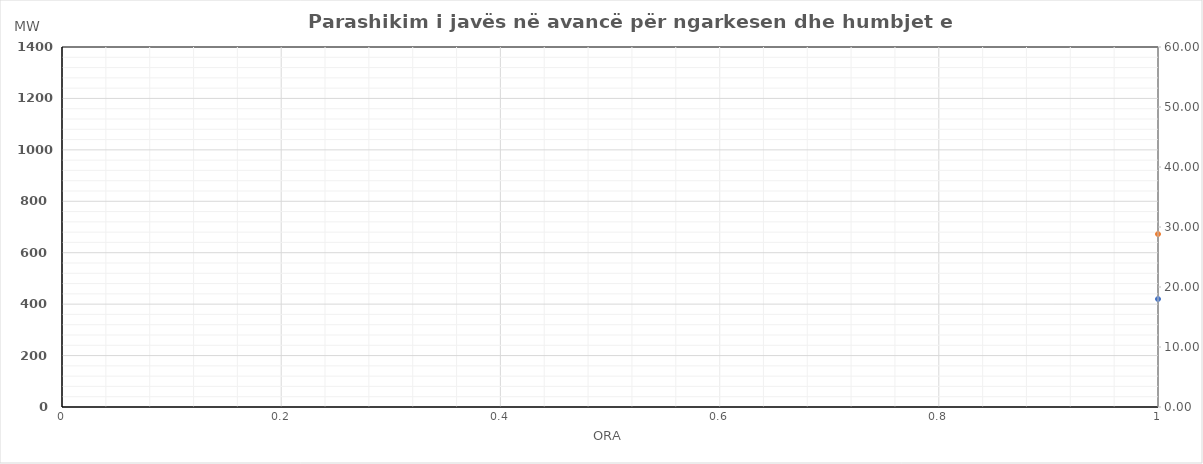
| Category | Ngarkesa (MWh) |
|---|---|
| 0 | 672.48 |
| 1 | 583.19 |
| 2 | 541.71 |
| 3 | 527.18 |
| 4 | 534 |
| 5 | 599 |
| 6 | 783.46 |
| 7 | 1047.6 |
| 8 | 1144.16 |
| 9 | 1153.89 |
| 10 | 1123.81 |
| 11 | 1043.94 |
| 12 | 1044.64 |
| 13 | 1029.51 |
| 14 | 1043.85 |
| 15 | 1056.7 |
| 16 | 1083.35 |
| 17 | 1177.5 |
| 18 | 1193.12 |
| 19 | 1138.35 |
| 20 | 1100.6 |
| 21 | 989.45 |
| 22 | 831.55 |
| 23 | 647.25 |
| 24 | 648.11 |
| 25 | 562.27 |
| 26 | 522.15 |
| 27 | 509.23 |
| 28 | 529.05 |
| 29 | 582.92 |
| 30 | 767.7 |
| 31 | 1034.07 |
| 32 | 1101.57 |
| 33 | 1067.79 |
| 34 | 1010.06 |
| 35 | 963.47 |
| 36 | 942.06 |
| 37 | 968.38 |
| 38 | 996.35 |
| 39 | 1006.48 |
| 40 | 1038.34 |
| 41 | 1187.85 |
| 42 | 1260.23 |
| 43 | 1254.3 |
| 44 | 1225 |
| 45 | 1113.99 |
| 46 | 954.74 |
| 47 | 776.86 |
| 48 | 628.65 |
| 49 | 544.87 |
| 50 | 508.05 |
| 51 | 497.04 |
| 52 | 506.14 |
| 53 | 571.02 |
| 54 | 756.66 |
| 55 | 1019.82 |
| 56 | 1093.47 |
| 57 | 1067.69 |
| 58 | 1003.68 |
| 59 | 953.72 |
| 60 | 930.95 |
| 61 | 953.04 |
| 62 | 976.3 |
| 63 | 985.27 |
| 64 | 1020.17 |
| 65 | 1167.2 |
| 66 | 1240.52 |
| 67 | 1246.43 |
| 68 | 1217.63 |
| 69 | 1107.74 |
| 70 | 964.06 |
| 71 | 809.66 |
| 72 | 672.04 |
| 73 | 578.37 |
| 74 | 534.25 |
| 75 | 519.94 |
| 76 | 524.23 |
| 77 | 596.14 |
| 78 | 781.55 |
| 79 | 1046.92 |
| 80 | 1112.47 |
| 81 | 1115.49 |
| 82 | 1031.78 |
| 83 | 978.42 |
| 84 | 955.14 |
| 85 | 992.45 |
| 86 | 1011.41 |
| 87 | 1028.73 |
| 88 | 1072.06 |
| 89 | 1216.78 |
| 90 | 1305.5 |
| 91 | 1299.12 |
| 92 | 1267.93 |
| 93 | 1157.12 |
| 94 | 1003.13 |
| 95 | 819.06 |
| 96 | 663.55 |
| 97 | 592.28 |
| 98 | 546.64 |
| 99 | 532.03 |
| 100 | 541.02 |
| 101 | 608.63 |
| 102 | 792.85 |
| 103 | 1060.23 |
| 104 | 1127.97 |
| 105 | 1103.39 |
| 106 | 1008.68 |
| 107 | 959.12 |
| 108 | 938.44 |
| 109 | 959.22 |
| 110 | 987.99 |
| 111 | 1000.75 |
| 112 | 1044.08 |
| 113 | 1198.69 |
| 114 | 1282.22 |
| 115 | 1277.51 |
| 116 | 1246.13 |
| 117 | 1133.43 |
| 118 | 975.13 |
| 119 | 784.23 |
| 120 | 623.35 |
| 121 | 548.6 |
| 122 | 515.27 |
| 123 | 500.76 |
| 124 | 509.27 |
| 125 | 571.97 |
| 126 | 724.11 |
| 127 | 943.39 |
| 128 | 1066.22 |
| 129 | 1079.61 |
| 130 | 1040.65 |
| 131 | 994.87 |
| 132 | 986.56 |
| 133 | 1001.62 |
| 134 | 1030.9 |
| 135 | 1040.25 |
| 136 | 1072.69 |
| 137 | 1198.16 |
| 138 | 1258.01 |
| 139 | 1246.18 |
| 140 | 1208.47 |
| 141 | 1100.81 |
| 142 | 938.63 |
| 143 | 785.13 |
| 144 | 704.08 |
| 145 | 604.36 |
| 146 | 539.13 |
| 147 | 514.25 |
| 148 | 515.03 |
| 149 | 553.12 |
| 150 | 655.88 |
| 151 | 840.76 |
| 152 | 997.68 |
| 153 | 1030.3 |
| 154 | 986.47 |
| 155 | 931.77 |
| 156 | 883.28 |
| 157 | 891.44 |
| 158 | 887.08 |
| 159 | 911.17 |
| 160 | 991.27 |
| 161 | 1202.52 |
| 162 | 1281.51 |
| 163 | 1285.38 |
| 164 | 1255.64 |
| 165 | 1138.33 |
| 166 | 963.64 |
| 167 | 769.73 |